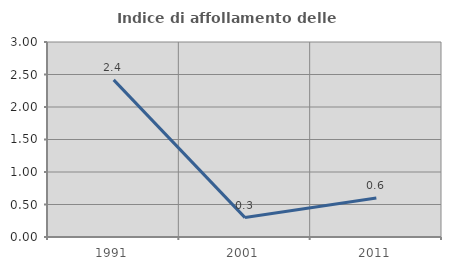
| Category | Indice di affollamento delle abitazioni  |
|---|---|
| 1991.0 | 2.417 |
| 2001.0 | 0.299 |
| 2011.0 | 0.601 |